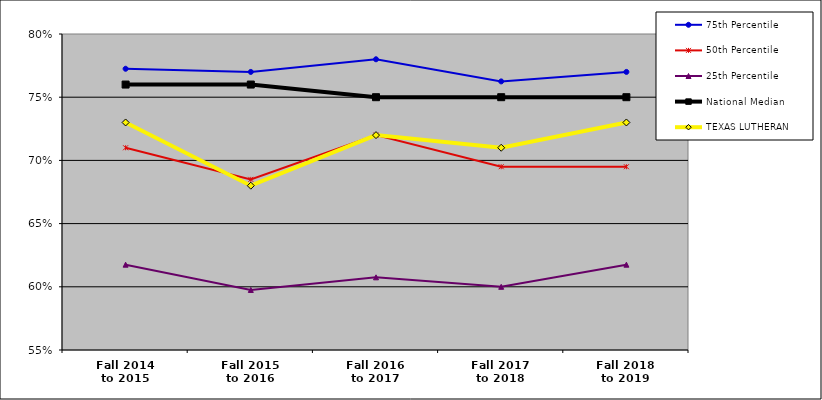
| Category | 75th Percentile | 50th Percentile | 25th Percentile | National Median | TEXAS LUTHERAN |
|---|---|---|---|---|---|
| Fall 2014
to 2015 | 0.772 | 0.71 | 0.617 | 0.76 | 0.73 |
| Fall 2015
to 2016 | 0.77 | 0.685 | 0.597 | 0.76 | 0.68 |
| Fall 2016
to 2017 | 0.78 | 0.72 | 0.607 | 0.75 | 0.72 |
| Fall 2017
to 2018 | 0.762 | 0.695 | 0.6 | 0.75 | 0.71 |
| Fall 2018
to 2019 | 0.77 | 0.695 | 0.617 | 0.75 | 0.73 |